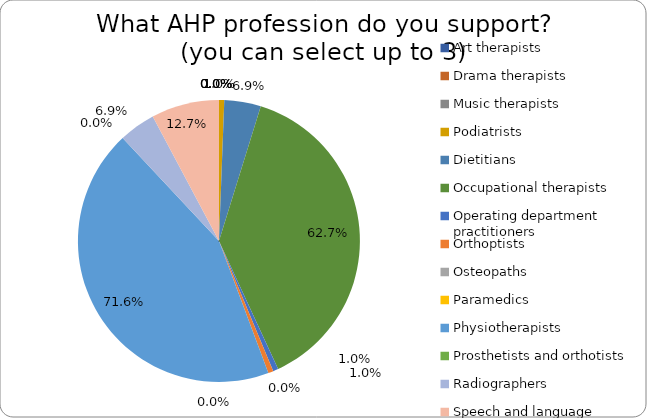
| Category | Series 0 |
|---|---|
| Art therapists | 0 |
| Drama therapists | 0 |
| Music therapists | 0 |
| Podiatrists | 0.01 |
| Dietitians | 0.069 |
| Occupational therapists | 0.627 |
| Operating department practitioners | 0.01 |
| Orthoptists | 0.01 |
| Osteopaths | 0 |
| Paramedics | 0 |
| Physiotherapists | 0.716 |
| Prosthetists and orthotists | 0 |
| Radiographers | 0.069 |
| Speech and language therapists | 0.127 |